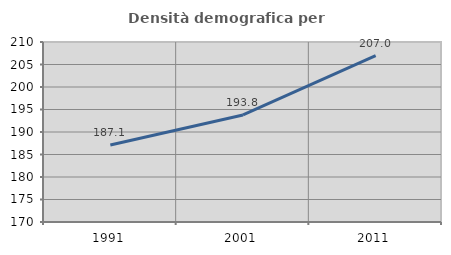
| Category | Densità demografica |
|---|---|
| 1991.0 | 187.115 |
| 2001.0 | 193.794 |
| 2011.0 | 206.997 |